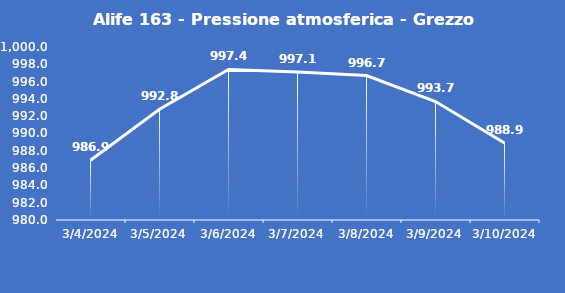
| Category | Alife 163 - Pressione atmosferica - Grezzo (hPa) |
|---|---|
| 3/4/24 | 986.9 |
| 3/5/24 | 992.8 |
| 3/6/24 | 997.4 |
| 3/7/24 | 997.1 |
| 3/8/24 | 996.7 |
| 3/9/24 | 993.7 |
| 3/10/24 | 988.9 |